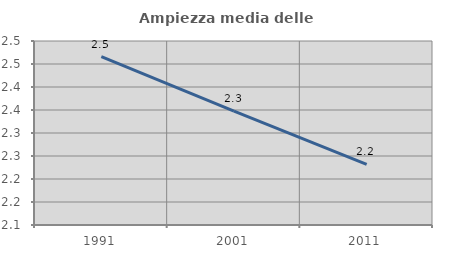
| Category | Ampiezza media delle famiglie |
|---|---|
| 1991.0 | 2.466 |
| 2001.0 | 2.347 |
| 2011.0 | 2.232 |